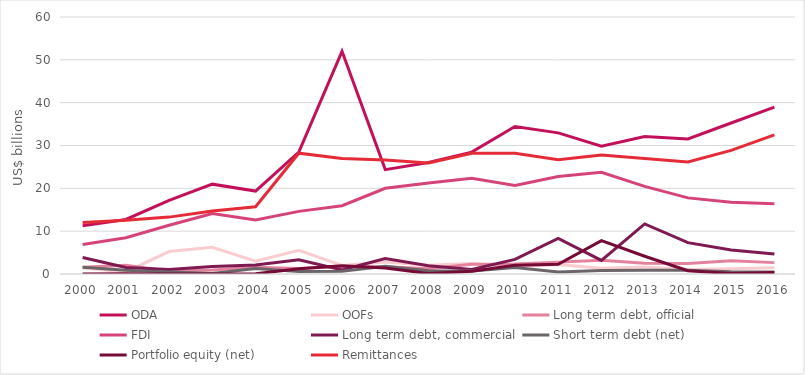
| Category | ODA | OOFs | Long term debt, official | FDI | Long term debt, commercial | Short term debt (net) | Portfolio equity (net) | Remittances |
|---|---|---|---|---|---|---|---|---|
| 2000.0 | 11.257 | 1.413 | 1.578 | 6.901 | 3.87 | 1.574 | 0.026 | 12.046 |
| 2001.0 | 12.739 | 0.49 | 2.07 | 8.468 | 1.501 | 0.892 | 0.047 | 12.552 |
| 2002.0 | 17.21 | 5.237 | 0.62 | 11.389 | 1.072 | 0.486 | 0.015 | 13.279 |
| 2003.0 | 20.977 | 6.255 | 0.945 | 14.115 | 1.741 | 0.12 | 0.022 | 14.694 |
| 2004.0 | 19.354 | 2.996 | 1.595 | 12.6 | 2.075 | 1.277 | 0.061 | 15.709 |
| 2005.0 | 28.441 | 5.552 | 1.273 | 14.623 | 3.328 | 0.612 | 1.209 | 28.203 |
| 2006.0 | 51.985 | 2.005 | 1.729 | 15.933 | 0.931 | 0.646 | 1.921 | 26.974 |
| 2007.0 | 24.372 | 2.786 | 1.677 | 20.022 | 3.596 | 1.791 | 1.416 | 26.634 |
| 2008.0 | 26.034 | 2.053 | 1.235 | 21.223 | 1.914 | 0.741 | 0.117 | 25.928 |
| 2009.0 | 28.452 | 2.459 | 2.297 | 22.341 | 1.049 | 0.729 | 0.63 | 28.172 |
| 2010.0 | 34.417 | 1.717 | 2.331 | 20.641 | 3.405 | 1.517 | 2.019 | 28.204 |
| 2011.0 | 32.946 | 2.203 | 2.772 | 22.74 | 8.318 | 0.482 | 2.274 | 26.656 |
| 2012.0 | 29.854 | 1.361 | 3.213 | 23.756 | 3.182 | 0.796 | 7.776 | 27.777 |
| 2013.0 | 32.102 | 1.623 | 2.526 | 20.464 | 11.686 | 0.869 | 4.147 | 26.949 |
| 2014.0 | 31.517 | 1.022 | 2.461 | 17.774 | 7.318 | 0.883 | 0.765 | 26.177 |
| 2015.0 | 35.254 | 1.232 | 3.121 | 16.734 | 5.61 | 0.502 | 0.099 | 28.857 |
| 2016.0 | 38.968 | 1.481 | 2.656 | 16.422 | 4.663 | 0.468 | 0.328 | 32.469 |